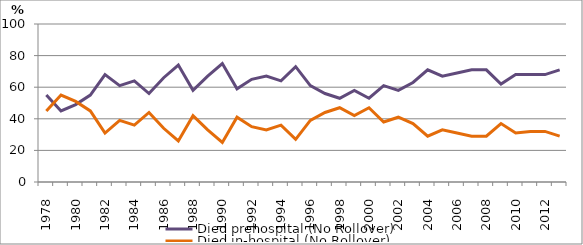
| Category | Died prehospital (No Rollover) | Died in-hospital (No Rollover) |
|---|---|---|
| 1978.0 | 55 | 45 |
| 1979.0 | 45 | 55 |
| 1980.0 | 49 | 51 |
| 1981.0 | 55 | 45 |
| 1982.0 | 68 | 31 |
| 1983.0 | 61 | 39 |
| 1984.0 | 64 | 36 |
| 1985.0 | 56 | 44 |
| 1986.0 | 66 | 34 |
| 1987.0 | 74 | 26 |
| 1988.0 | 58 | 42 |
| 1989.0 | 67 | 33 |
| 1990.0 | 75 | 25 |
| 1991.0 | 59 | 41 |
| 1992.0 | 65 | 35 |
| 1993.0 | 67 | 33 |
| 1994.0 | 64 | 36 |
| 1995.0 | 73 | 27 |
| 1996.0 | 61 | 39 |
| 1997.0 | 56 | 44 |
| 1998.0 | 53 | 47 |
| 1999.0 | 58 | 42 |
| 2000.0 | 53 | 47 |
| 2001.0 | 61 | 38 |
| 2002.0 | 58 | 41 |
| 2003.0 | 63 | 37 |
| 2004.0 | 71 | 29 |
| 2005.0 | 67 | 33 |
| 2006.0 | 69 | 31 |
| 2007.0 | 71 | 29 |
| 2008.0 | 71 | 29 |
| 2009.0 | 62 | 37 |
| 2010.0 | 68 | 31 |
| 2011.0 | 68 | 32 |
| 2012.0 | 68 | 32 |
| 2013.0 | 71 | 29 |